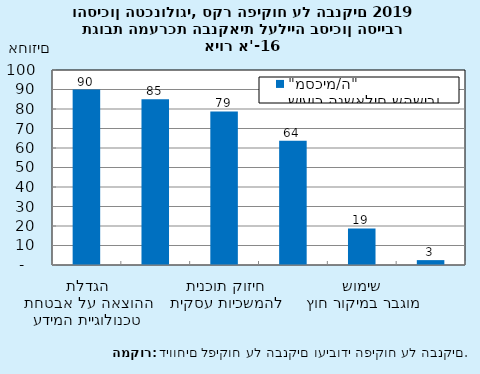
| Category | שיעור הנשאלים שהשיבו "מסכימ/ה" |
|---|---|
| הגדלת ההוצאה על אבטחת טכנולוגיית המידע | 90 |
| הטמעת טכנולוגיות חדשות לניטור והגנה | 85 |
| חיזוק תוכנית להמשכיות עסקית | 78.75 |
| בניית תוכנית לטיפול/ החלפת במערכות ליבה | 63.75 |
| שימוש מוגבר במיקור חוץ | 18.75 |
| אין תגובה ספציפית עד כה | 2.5 |